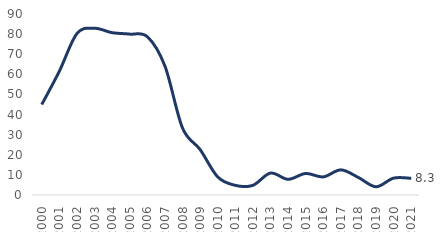
| Category | Series 0 |
|---|---|
| 2000.0 | 45 |
| 2001.0 | 61.6 |
| 2002.0 | 80.3 |
| 2003.0 | 82.9 |
| 2004.0 | 80.7 |
| 2005.0 | 80 |
| 2006.0 | 78.7 |
| 2007.0 | 64.1 |
| 2008.0 | 33.3 |
| 2009.0 | 22.6 |
| 2010.0 | 9 |
| 2011.0 | 4.8 |
| 2012.0 | 4.8 |
| 2013.0 | 10.9 |
| 2014.0 | 7.8 |
| 2015.0 | 10.7 |
| 2016.0 | 9 |
| 2017.0 | 12.5 |
| 2018.0 | 8.7 |
| 2019.0 | 4.1 |
| 2020.0 | 8.4 |
| 2021.0 | 8.3 |